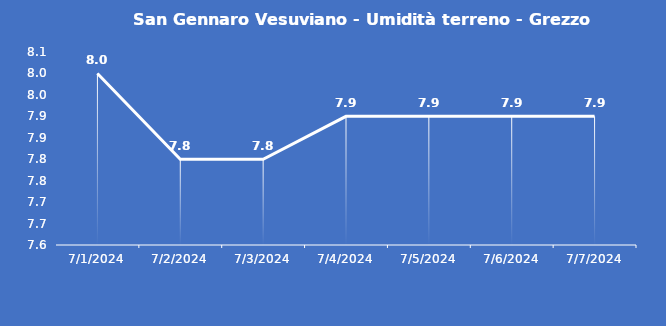
| Category | San Gennaro Vesuviano - Umidità terreno - Grezzo (%VWC) |
|---|---|
| 7/1/24 | 8 |
| 7/2/24 | 7.8 |
| 7/3/24 | 7.8 |
| 7/4/24 | 7.9 |
| 7/5/24 | 7.9 |
| 7/6/24 | 7.9 |
| 7/7/24 | 7.9 |